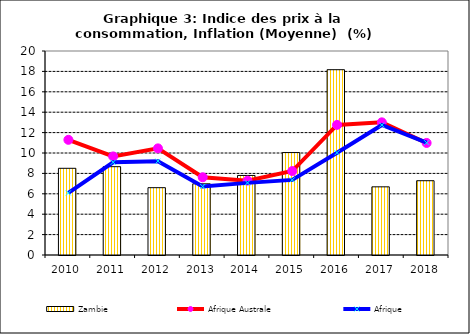
| Category | Zambie |
|---|---|
| 2010.0 | 8.5 |
| 2011.0 | 8.659 |
| 2012.0 | 6.6 |
| 2013.0 | 6.98 |
| 2014.0 | 7.8 |
| 2015.0 | 10.042 |
| 2016.0 | 18.167 |
| 2017.0 | 6.682 |
| 2018.0 | 7.283 |